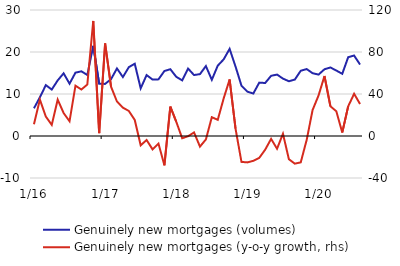
| Category | Genuinely new mortgages (volumes) |
|---|---|
|  1/16 | 6.595 |
| 2 | 9.209 |
| 3 | 12.11 |
| 4 | 11.056 |
| 5 | 13.231 |
| 6 | 14.924 |
| 7 | 12.457 |
| 8 | 15.08 |
| 9 | 15.402 |
| 10 | 14.526 |
| 11 | 21.476 |
| 12 | 12.426 |
|  1/17 | 12.407 |
| 2 | 13.532 |
| 3 | 16.082 |
| 4 | 14.037 |
| 5 | 16.389 |
| 6 | 17.21 |
| 7 | 11.35 |
| 8 | 14.507 |
| 9 | 13.438 |
| 10 | 13.483 |
| 11 | 15.471 |
| 12 | 15.901 |
|  1/18 | 14.098 |
| 2 | 13.242 |
| 3 | 16.05 |
| 4 | 14.512 |
| 5 | 14.735 |
| 6 | 16.649 |
| 7 | 13.383 |
| 8 | 16.743 |
| 9 | 18.25 |
| 10 | 20.74 |
| 11 | 16.547 |
| 12 | 11.98 |
|  1/19 | 10.554 |
| 2 | 10.113 |
| 3 | 12.707 |
| 4 | 12.621 |
| 5 | 14.329 |
| 6 | 14.627 |
| 7 | 13.667 |
| 8 | 13.036 |
| 9 | 13.441 |
| 10 | 15.534 |
| 11 | 15.936 |
| 12 | 14.95 |
|  1/20 | 14.622 |
| 2 | 15.887 |
| 3 | 16.318 |
| 4 | 15.586 |
| 5 | 14.804 |
| 6 | 18.757 |
| 7 | 19.162 |
| 8 | 17.007 |